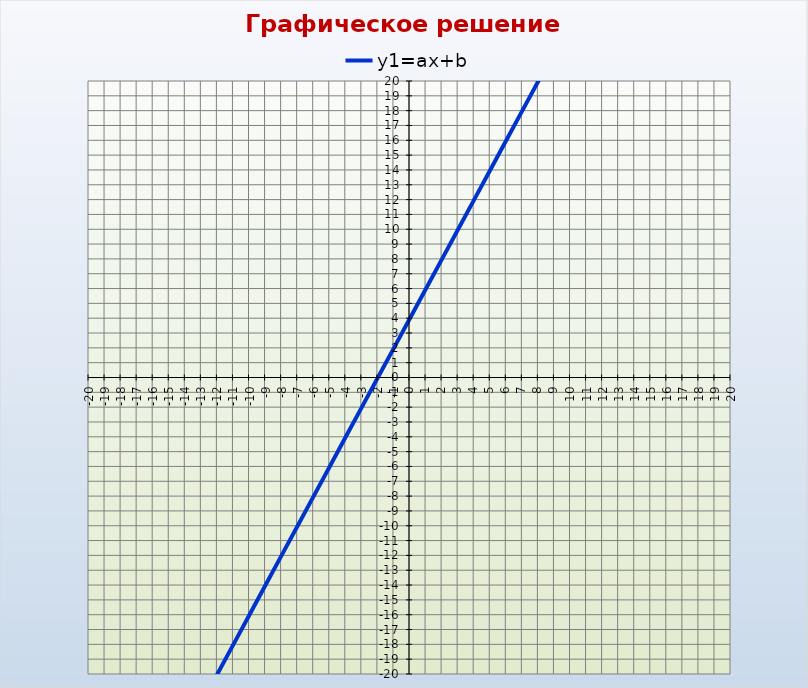
| Category | y1=ax+b |
|---|---|
| -20.0 | -36 |
| -19.0 | -34 |
| -18.0 | -32 |
| -17.0 | -30 |
| -16.0 | -28 |
| -15.0 | -26 |
| -14.0 | -24 |
| -13.0 | -22 |
| -12.0 | -20 |
| -11.0 | -18 |
| -10.0 | -16 |
| -9.0 | -14 |
| -8.0 | -12 |
| -7.0 | -10 |
| -6.0 | -8 |
| -5.0 | -6 |
| -4.0 | -4 |
| -3.0 | -2 |
| -2.0 | 0 |
| -1.0 | 2 |
| 0.0 | 4 |
| 1.0 | 6 |
| 2.0 | 8 |
| 3.0 | 10 |
| 4.0 | 12 |
| 5.0 | 14 |
| 6.0 | 16 |
| 7.0 | 18 |
| 8.0 | 20 |
| 9.0 | 22 |
| 10.0 | 24 |
| 11.0 | 26 |
| 12.0 | 28 |
| 13.0 | 30 |
| 14.0 | 32 |
| 15.0 | 34 |
| 16.0 | 36 |
| 17.0 | 38 |
| 18.0 | 40 |
| 19.0 | 42 |
| 20.0 | 44 |